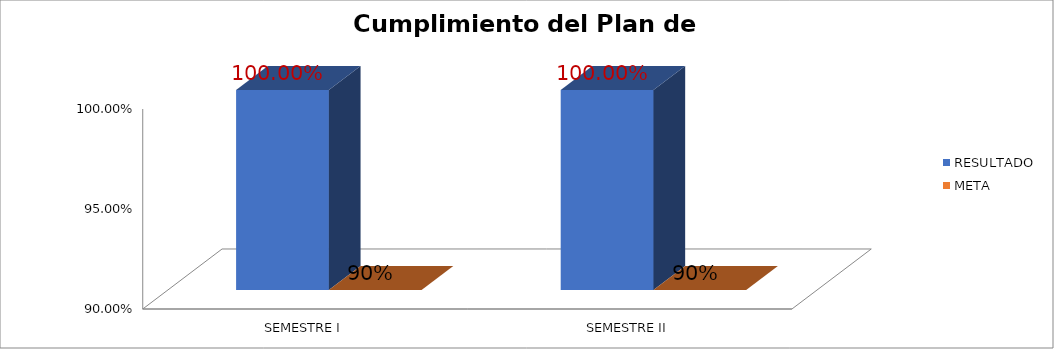
| Category | RESULTADO | META |
|---|---|---|
| SEMESTRE I | 1 | 0.9 |
| SEMESTRE II | 1 | 0.9 |